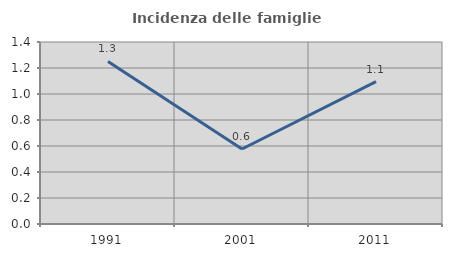
| Category | Incidenza delle famiglie numerose |
|---|---|
| 1991.0 | 1.251 |
| 2001.0 | 0.577 |
| 2011.0 | 1.095 |